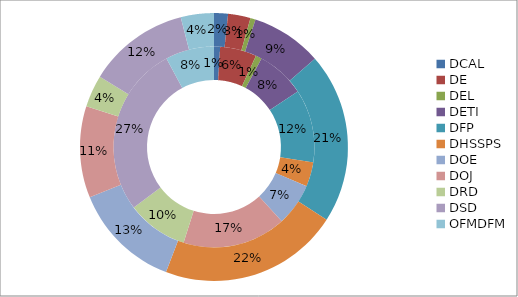
| Category | % Surveys | % Compliance Burden |
|---|---|---|
| DCAL | 0.01 | 0.017 |
| DE | 0.059 | 0.027 |
| DEL | 0.01 | 0.006 |
| DETI | 0.078 | 0.086 |
| DFP | 0.118 | 0.206 |
| DHSSPS | 0.039 | 0.217 |
| DOE | 0.069 | 0.13 |
| DOJ | 0.167 | 0.11 |
| DRD | 0.098 | 0.039 |
| DSD | 0.275 | 0.122 |
| OFMDFM | 0.078 | 0.04 |